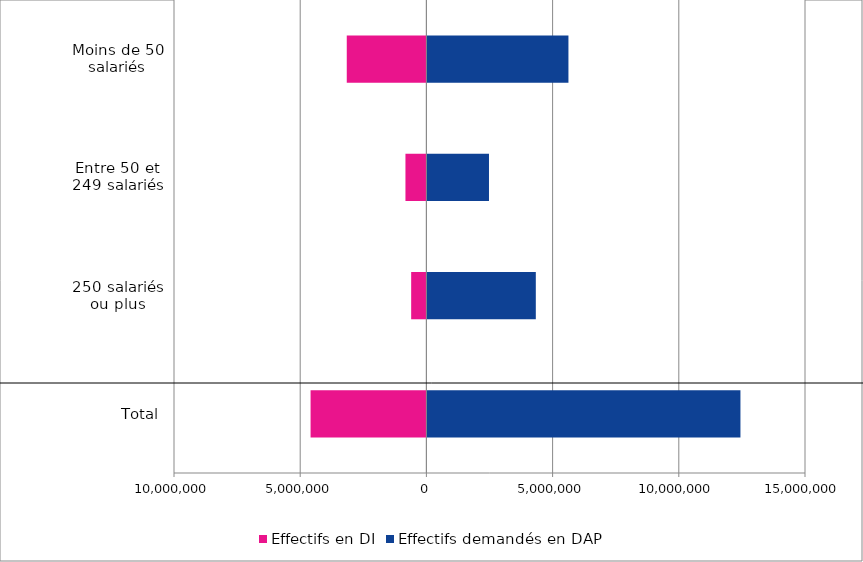
| Category | Effectifs en DI | Effectifs demandés en DAP |
|---|---|---|
| Total | -4588935 | 12442241 |
| 250 salariés ou plus | -603752 | 4334997 |
| Entre 50 et 249 salariés | -829971 | 2479642 |
| Moins de 50 salariés | -3155212 | 5627602 |